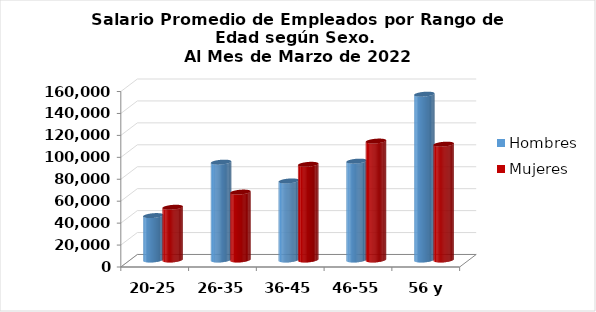
| Category | Hombres | Mujeres |
|---|---|---|
| 20-25 | 40490 | 48096.474 |
| 26-35 | 89227.833 | 61917.975 |
| 36-45 | 72083.263 | 87240.893 |
| 46-55 | 90145.238 | 108423.087 |
| 56 y más | 151208.696 | 105612.343 |